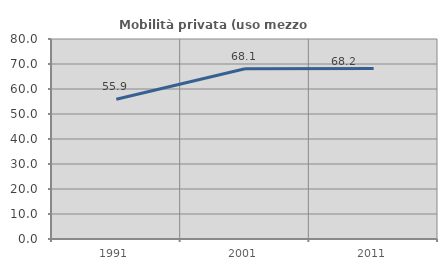
| Category | Mobilità privata (uso mezzo privato) |
|---|---|
| 1991.0 | 55.921 |
| 2001.0 | 68.067 |
| 2011.0 | 68.224 |